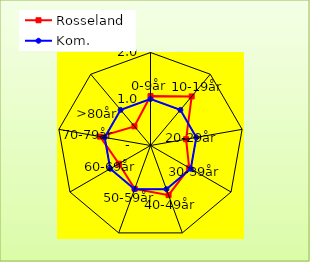
| Category | Rosseland | Kom. |
|---|---|---|
| 0-9år | 1.063 | 1 |
| 10-19år | 1.377 | 1 |
| 20-29år | 0.777 | 1 |
| 30-39år | 0.961 | 1 |
| 40-49år | 1.136 | 1 |
| 50-59år | 0.992 | 1 |
| 60-69år | 0.784 | 1 |
| 70-79år | 1.101 | 1 |
| >80år | 0.538 | 1 |